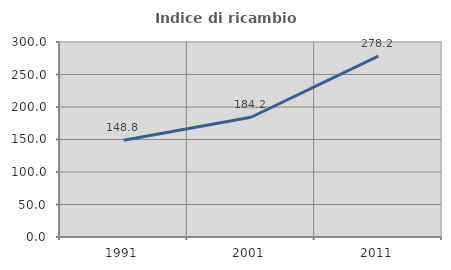
| Category | Indice di ricambio occupazionale  |
|---|---|
| 1991.0 | 148.825 |
| 2001.0 | 184.227 |
| 2011.0 | 278.221 |